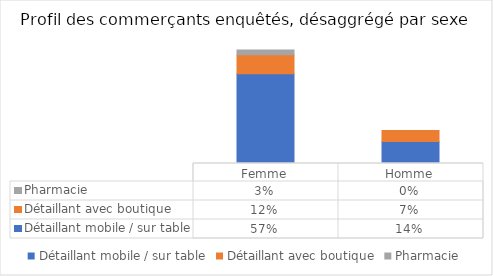
| Category | Détaillant mobile / sur table | Détaillant avec boutique | Pharmacie |
|---|---|---|---|
| Femme | 0.57 | 0.12 | 0.03 |
| Homme | 0.14 | 0.07 | 0 |